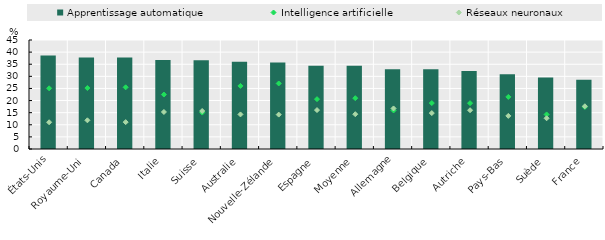
| Category | Apprentissage automatique |
|---|---|
| États‑Unis | 38.6 |
| Royaume‑Uni | 37.761 |
| Canada | 37.724 |
| Italie | 36.773 |
| Suisse | 36.636 |
| Australie | 36.039 |
| Nouvelle‑Zélande | 35.741 |
| Espagne | 34.409 |
| Moyenne | 34.331 |
| Allemagne | 32.944 |
| Belgique | 32.888 |
| Autriche | 32.164 |
| Pays­Bas | 30.857 |
| Suède | 29.489 |
| France | 28.61 |